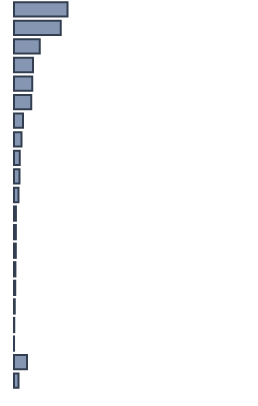
| Category | Percentatge |
|---|---|
| 0 | 22.291 |
| 1 | 19.476 |
| 2 | 10.696 |
| 3 | 7.942 |
| 4 | 7.653 |
| 5 | 7.161 |
| 6 | 3.768 |
| 7 | 3.17 |
| 8 | 2.431 |
| 9 | 2.309 |
| 10 | 1.917 |
| 11 | 0.796 |
| 12 | 0.775 |
| 13 | 0.75 |
| 14 | 0.584 |
| 15 | 0.515 |
| 16 | 0.313 |
| 17 | 0.109 |
| 18 | 0.017 |
| 19 | 5.436 |
| 20 | 1.894 |